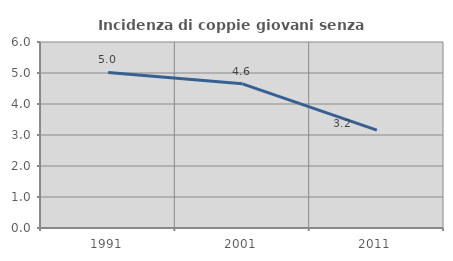
| Category | Incidenza di coppie giovani senza figli |
|---|---|
| 1991.0 | 5.018 |
| 2001.0 | 4.65 |
| 2011.0 | 3.155 |